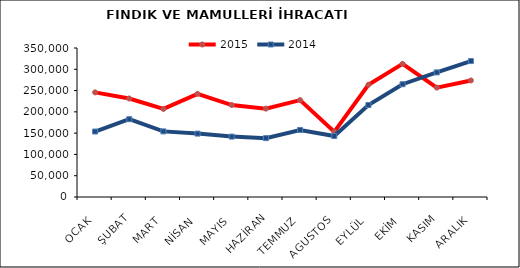
| Category | 2015 | 2014 |
|---|---|---|
| OCAK | 245760.436 | 153795.595 |
| ŞUBAT | 231388.246 | 182753.25 |
| MART | 206854.618 | 154123.444 |
| NİSAN | 242419.208 | 148895.738 |
| MAYIS | 216021.488 | 141867.426 |
| HAZİRAN | 207612.032 | 138260.343 |
| TEMMUZ | 227567.05 | 157457.571 |
| AGUSTOS | 153125.991 | 143213.512 |
| EYLÜL | 263593.163 | 216013.983 |
| EKİM | 312699.094 | 264887.491 |
| KASIM | 256972.843 | 292675.993 |
| ARALIK | 273798.553 | 319292.28 |